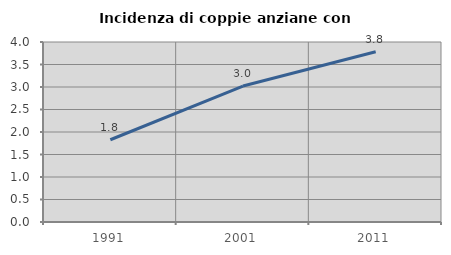
| Category | Incidenza di coppie anziane con figli |
|---|---|
| 1991.0 | 1.828 |
| 2001.0 | 3.021 |
| 2011.0 | 3.782 |